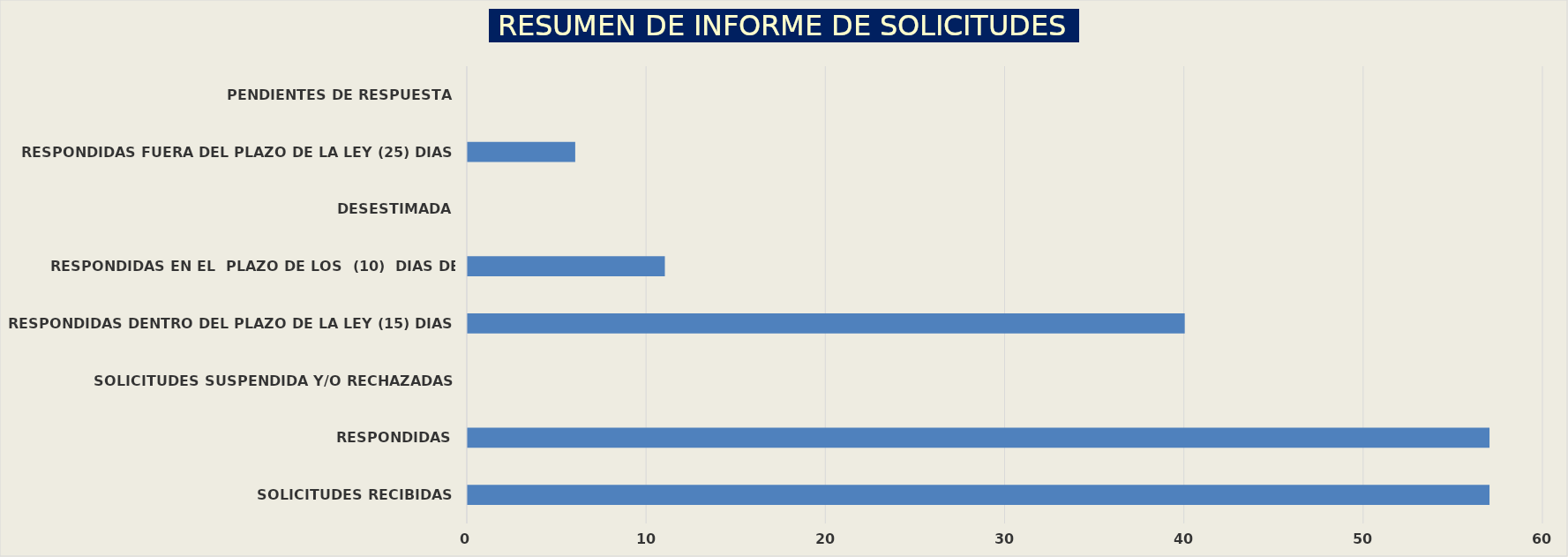
| Category | Series 0 |
|---|---|
| SOLICITUDES RECIBIDAS | 57 |
| RESPONDIDAS | 57 |
| SOLICITUDES SUSPENDIDA Y/O RECHAZADAS | 0 |
| RESPONDIDAS DENTRO DEL PLAZO DE LA LEY (15) DIAS | 40 |
| RESPONDIDAS EN EL  PLAZO DE LOS  (10)  DIAS DE PRORROGA | 11 |
| DESESTIMADA | 0 |
| RESPONDIDAS FUERA DEL PLAZO DE LA LEY (25) DIAS | 6 |
| PENDIENTES DE RESPUESTA | 0 |